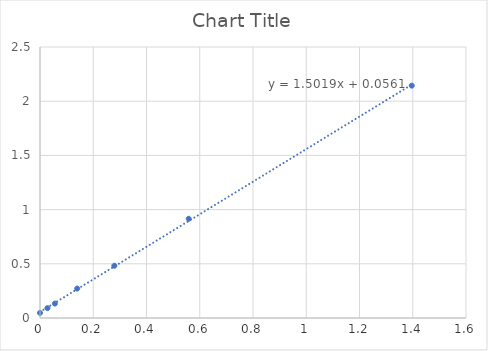
| Category | Series 0 |
|---|---|
| 0.0 | 0.047 |
| 0.027925 | 0.091 |
| 0.05585 | 0.133 |
| 0.139625 | 0.272 |
| 0.27925 | 0.482 |
| 0.5585 | 0.916 |
| 1.39625 | 2.144 |